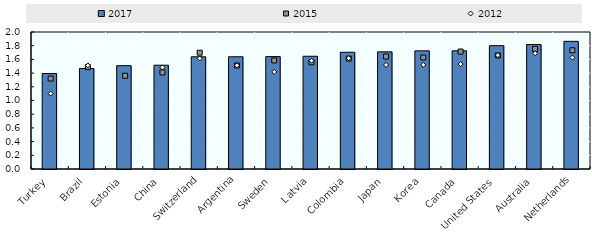
| Category | 2017 |
|---|---|
| Turkey | 1.393 |
| Brazil | 1.467 |
| Estonia | 1.509 |
| China | 1.515 |
| Switzerland | 1.638 |
| Argentina | 1.638 |
| Sweden | 1.641 |
| Latvia | 1.646 |
| Colombia | 1.704 |
| Japan | 1.71 |
| Korea | 1.725 |
| Canada | 1.725 |
| United States | 1.8 |
| Australia | 1.818 |
| Netherlands | 1.864 |